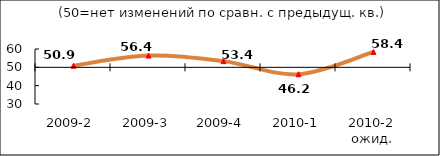
| Category | Диф.индекс ↓ |
|---|---|
| 2009-2 | 50.89 |
| 2009-3 | 56.415 |
| 2009-4 | 53.385 |
| 2010-1 | 46.225 |
| 2010-2 ожид. | 58.405 |